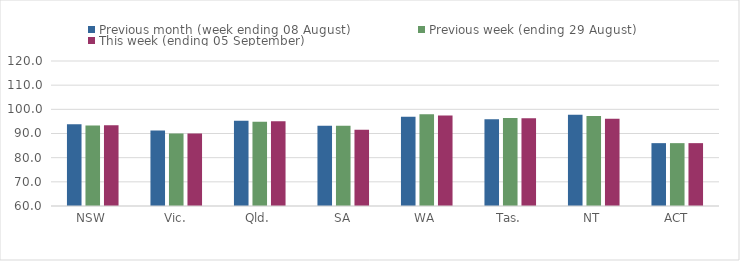
| Category | Previous month (week ending 08 August) | Previous week (ending 29 August) | This week (ending 05 September) |
|---|---|---|---|
| NSW | 93.85 | 93.31 | 93.4 |
| Vic. | 91.25 | 90.03 | 90.03 |
| Qld. | 95.25 | 94.87 | 95.11 |
| SA | 93.25 | 93.25 | 91.54 |
| WA | 96.96 | 97.97 | 97.4 |
| Tas. | 95.89 | 96.44 | 96.3 |
| NT | 97.79 | 97.24 | 96.14 |
| ACT | 86.01 | 86.01 | 86.01 |